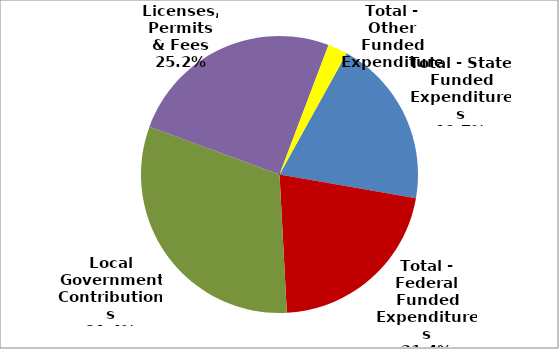
| Category | Series 0 |
|---|---|
| Total - State Funded Expenditures | 759606 |
| Total - Federal Funded Expenditures | 826957 |
| Local Government Contributions | 1213313 |
| Licenses, Permits & Fees | 971588 |
| Total - Other Funded Expenditures | 88668 |